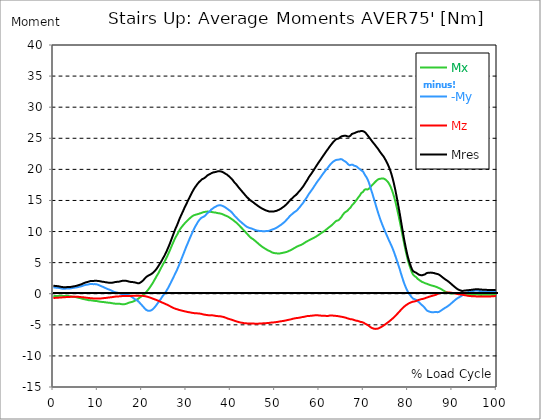
| Category |  Mx |  -My |  Mz |  Mres |
|---|---|---|---|---|
| 0.0 | -0.363 | 1.043 | -0.68 | 1.304 |
| 0.16678370786516855 | -0.363 | 1.006 | -0.68 | 1.276 |
| 0.3335674157303371 | -0.373 | 0.988 | -0.671 | 1.258 |
| 0.5003511235955057 | -0.373 | 0.978 | -0.661 | 1.248 |
| 0.6671348314606742 | -0.363 | 0.978 | -0.652 | 1.239 |
| 0.8339185393258427 | -0.373 | 0.96 | -0.643 | 1.22 |
| 1.0007022471910114 | -0.363 | 0.95 | -0.634 | 1.211 |
| 1.1674859550561796 | -0.345 | 0.941 | -0.624 | 1.192 |
| 1.3342696629213484 | -0.335 | 0.932 | -0.624 | 1.174 |
| 1.5010533707865168 | -0.326 | 0.904 | -0.615 | 1.155 |
| 1.6678370786516854 | -0.326 | 0.866 | -0.615 | 1.118 |
| 1.8346207865168538 | -0.335 | 0.829 | -0.606 | 1.09 |
| 2.001404494382023 | -0.345 | 0.811 | -0.587 | 1.071 |
| 2.1681882022471908 | -0.345 | 0.801 | -0.578 | 1.062 |
| 2.334971910112359 | -0.354 | 0.801 | -0.568 | 1.053 |
| 2.501755617977528 | -0.354 | 0.801 | -0.559 | 1.053 |
| 2.668539325842697 | -0.345 | 0.811 | -0.55 | 1.043 |
| 2.8353230337078656 | -0.326 | 0.82 | -0.54 | 1.043 |
| 3.0021067415730336 | -0.335 | 0.838 | -0.54 | 1.062 |
| 3.168890449438202 | -0.345 | 0.866 | -0.54 | 1.081 |
| 3.335674157303371 | -0.354 | 0.857 | -0.531 | 1.071 |
| 3.502457865168539 | -0.382 | 0.848 | -0.522 | 1.071 |
| 3.6692415730337076 | -0.401 | 0.838 | -0.512 | 1.071 |
| 3.8360252808988764 | -0.419 | 0.857 | -0.503 | 1.09 |
| 4.002808988764046 | -0.447 | 0.876 | -0.494 | 1.109 |
| 4.169592696629214 | -0.466 | 0.904 | -0.494 | 1.127 |
| 4.3363764044943816 | -0.475 | 0.922 | -0.484 | 1.146 |
| 4.50316011235955 | -0.484 | 0.941 | -0.484 | 1.174 |
| 4.669943820224718 | -0.494 | 0.969 | -0.494 | 1.192 |
| 4.836727528089888 | -0.512 | 0.978 | -0.503 | 1.22 |
| 5.003511235955056 | -0.531 | 0.997 | -0.503 | 1.239 |
| 5.170294943820225 | -0.559 | 1.015 | -0.503 | 1.267 |
| 5.337078651685394 | -0.596 | 1.034 | -0.503 | 1.295 |
| 5.5038623595505625 | -0.643 | 1.053 | -0.503 | 1.332 |
| 5.670646067415731 | -0.652 | 1.09 | -0.503 | 1.379 |
| 5.837429775280899 | -0.671 | 1.127 | -0.512 | 1.407 |
| 6.004213483146067 | -0.699 | 1.155 | -0.531 | 1.444 |
| 6.170997191011236 | -0.727 | 1.174 | -0.54 | 1.481 |
| 6.329002808988764 | -0.764 | 1.202 | -0.55 | 1.528 |
| 6.495786516853932 | -0.811 | 1.239 | -0.559 | 1.584 |
| 6.662570224719101 | -0.838 | 1.286 | -0.568 | 1.64 |
| 6.82935393258427 | -0.866 | 1.332 | -0.578 | 1.696 |
| 6.9961376404494375 | -0.885 | 1.379 | -0.596 | 1.742 |
| 7.162921348314607 | -0.913 | 1.416 | -0.615 | 1.798 |
| 7.329705056179775 | -0.932 | 1.435 | -0.634 | 1.826 |
| 7.496488764044945 | -0.96 | 1.453 | -0.652 | 1.854 |
| 7.663272471910113 | -0.988 | 1.463 | -0.661 | 1.882 |
| 7.830056179775281 | -1.015 | 1.481 | -0.671 | 1.919 |
| 7.996839887640449 | -1.043 | 1.509 | -0.68 | 1.956 |
| 8.16362359550562 | -1.053 | 1.537 | -0.699 | 1.994 |
| 8.330407303370787 | -1.053 | 1.584 | -0.717 | 2.031 |
| 8.497191011235955 | -1.062 | 1.593 | -0.727 | 2.05 |
| 8.663974719101123 | -1.081 | 1.574 | -0.736 | 2.05 |
| 8.830758426966291 | -1.09 | 1.556 | -0.745 | 2.04 |
| 8.99754213483146 | -1.118 | 1.537 | -0.755 | 2.05 |
| 9.16432584269663 | -1.146 | 1.547 | -0.764 | 2.068 |
| 9.331109550561798 | -1.155 | 1.547 | -0.773 | 2.078 |
| 9.497893258426966 | -1.165 | 1.547 | -0.773 | 2.087 |
| 9.664676966292134 | -1.174 | 1.537 | -0.773 | 2.087 |
| 9.831460674157304 | -1.183 | 1.5 | -0.783 | 2.068 |
| 9.998244382022472 | -1.202 | 1.463 | -0.783 | 2.059 |
| 10.16502808988764 | -1.22 | 1.416 | -0.783 | 2.04 |
| 10.331811797752808 | -1.258 | 1.36 | -0.773 | 2.031 |
| 10.498595505617978 | -1.286 | 1.314 | -0.773 | 2.012 |
| 10.665379213483147 | -1.295 | 1.258 | -0.764 | 1.984 |
| 10.832162921348315 | -1.314 | 1.202 | -0.745 | 1.956 |
| 10.998946629213483 | -1.323 | 1.155 | -0.736 | 1.938 |
| 11.165730337078653 | -1.332 | 1.109 | -0.717 | 1.919 |
| 11.33251404494382 | -1.342 | 1.062 | -0.708 | 1.91 |
| 11.49929775280899 | -1.351 | 1.006 | -0.699 | 1.891 |
| 11.666081460674157 | -1.369 | 0.941 | -0.689 | 1.863 |
| 11.832865168539326 | -1.388 | 0.885 | -0.68 | 1.845 |
| 11.999648876404493 | -1.407 | 0.829 | -0.661 | 1.826 |
| 12.166432584269662 | -1.425 | 0.783 | -0.643 | 1.807 |
| 12.333216292134832 | -1.435 | 0.727 | -0.624 | 1.789 |
| 12.5 | -1.435 | 0.68 | -0.606 | 1.77 |
| 12.66678370786517 | -1.444 | 0.643 | -0.596 | 1.761 |
| 12.833567415730336 | -1.463 | 0.596 | -0.578 | 1.761 |
| 13.000351123595506 | -1.491 | 0.54 | -0.568 | 1.77 |
| 13.167134831460674 | -1.519 | 0.475 | -0.559 | 1.77 |
| 13.333918539325843 | -1.537 | 0.419 | -0.54 | 1.779 |
| 13.500702247191011 | -1.556 | 0.363 | -0.522 | 1.789 |
| 13.667485955056181 | -1.574 | 0.307 | -0.494 | 1.826 |
| 13.834269662921349 | -1.593 | 0.27 | -0.484 | 1.863 |
| 14.001053370786519 | -1.602 | 0.233 | -0.466 | 1.882 |
| 14.167837078651687 | -1.602 | 0.196 | -0.456 | 1.891 |
| 14.334620786516853 | -1.612 | 0.186 | -0.447 | 1.91 |
| 14.501404494382026 | -1.612 | 0.168 | -0.447 | 1.919 |
| 14.668188202247192 | -1.612 | 0.13 | -0.438 | 1.919 |
| 14.834971910112362 | -1.612 | 0.075 | -0.419 | 1.947 |
| 15.001755617977528 | -1.621 | 0.028 | -0.41 | 1.975 |
| 15.168539325842698 | -1.64 | -0.019 | -0.401 | 2.003 |
| 15.335323033707864 | -1.668 | -0.056 | -0.391 | 2.04 |
| 15.502106741573034 | -1.686 | -0.093 | -0.373 | 2.068 |
| 15.6688904494382 | -1.705 | -0.13 | -0.363 | 2.087 |
| 15.83567415730337 | -1.696 | -0.14 | -0.363 | 2.087 |
| 16.00245786516854 | -1.686 | -0.14 | -0.354 | 2.096 |
| 16.16924157303371 | -1.677 | -0.14 | -0.354 | 2.105 |
| 16.336025280898877 | -1.64 | -0.149 | -0.363 | 2.087 |
| 16.502808988764045 | -1.602 | -0.158 | -0.363 | 2.059 |
| 16.669592696629216 | -1.556 | -0.177 | -0.363 | 2.031 |
| 16.83637640449438 | -1.5 | -0.196 | -0.373 | 1.994 |
| 17.003160112359552 | -1.453 | -0.224 | -0.373 | 1.966 |
| 17.169943820224717 | -1.416 | -0.279 | -0.373 | 1.938 |
| 17.336727528089888 | -1.388 | -0.354 | -0.363 | 1.91 |
| 17.503511235955056 | -1.369 | -0.438 | -0.354 | 1.901 |
| 17.670294943820224 | -1.332 | -0.512 | -0.354 | 1.882 |
| 17.837078651685395 | -1.295 | -0.587 | -0.345 | 1.873 |
| 18.003862359550563 | -1.258 | -0.671 | -0.335 | 1.863 |
| 18.17064606741573 | -1.202 | -0.773 | -0.326 | 1.845 |
| 18.3374297752809 | -1.137 | -0.866 | -0.317 | 1.826 |
| 18.504213483146067 | -1.071 | -0.941 | -0.317 | 1.826 |
| 18.662219101123597 | -1.015 | -0.978 | -0.317 | 1.77 |
| 18.829002808988765 | -0.95 | -1.043 | -0.317 | 1.714 |
| 18.995786516853933 | -0.876 | -1.127 | -0.317 | 1.696 |
| 19.1625702247191 | -0.783 | -1.23 | -0.307 | 1.677 |
| 19.32935393258427 | -0.699 | -1.351 | -0.307 | 1.696 |
| 19.49613764044944 | -0.624 | -1.5 | -0.307 | 1.751 |
| 19.662921348314608 | -0.531 | -1.612 | -0.307 | 1.807 |
| 19.829705056179776 | -0.438 | -1.751 | -0.317 | 1.901 |
| 19.996488764044944 | -0.345 | -1.873 | -0.326 | 1.984 |
| 20.163272471910112 | -0.252 | -1.994 | -0.335 | 2.078 |
| 20.33005617977528 | -0.149 | -2.143 | -0.354 | 2.208 |
| 20.49683988764045 | -0.037 | -2.273 | -0.373 | 2.338 |
| 20.663623595505616 | 0.084 | -2.404 | -0.401 | 2.478 |
| 20.830407303370787 | 0.196 | -2.525 | -0.419 | 2.599 |
| 20.997191011235955 | 0.317 | -2.627 | -0.447 | 2.72 |
| 21.163974719101123 | 0.456 | -2.683 | -0.484 | 2.795 |
| 21.330758426966295 | 0.596 | -2.73 | -0.512 | 2.879 |
| 21.497542134831463 | 0.745 | -2.758 | -0.55 | 2.944 |
| 21.66432584269663 | 0.913 | -2.758 | -0.587 | 3.009 |
| 21.8311095505618 | 1.09 | -2.73 | -0.624 | 3.074 |
| 21.997893258426966 | 1.258 | -2.692 | -0.671 | 3.13 |
| 22.164676966292134 | 1.435 | -2.646 | -0.717 | 3.195 |
| 22.331460674157306 | 1.621 | -2.553 | -0.764 | 3.289 |
| 22.498244382022467 | 1.826 | -2.432 | -0.811 | 3.391 |
| 22.66502808988764 | 2.031 | -2.32 | -0.848 | 3.503 |
| 22.831811797752806 | 2.245 | -2.189 | -0.894 | 3.624 |
| 22.99859550561798 | 2.45 | -2.05 | -0.941 | 3.754 |
| 23.165379213483146 | 2.664 | -1.901 | -0.988 | 3.894 |
| 23.332162921348313 | 2.879 | -1.733 | -1.034 | 4.053 |
| 23.49894662921348 | 3.074 | -1.574 | -1.081 | 4.23 |
| 23.665730337078653 | 3.261 | -1.397 | -1.127 | 4.416 |
| 23.83251404494382 | 3.484 | -1.22 | -1.183 | 4.612 |
| 23.999297752808985 | 3.717 | -1.071 | -1.239 | 4.779 |
| 24.166081460674157 | 3.959 | -0.913 | -1.295 | 4.966 |
| 24.332865168539325 | 4.192 | -0.736 | -1.351 | 5.18 |
| 24.499648876404496 | 4.425 | -0.55 | -1.397 | 5.394 |
| 24.666432584269664 | 4.658 | -0.363 | -1.453 | 5.627 |
| 24.833216292134832 | 4.863 | -0.214 | -1.5 | 5.832 |
| 25.0 | 5.049 | -0.084 | -1.556 | 6.028 |
| 25.16678370786517 | 5.273 | 0.084 | -1.602 | 6.261 |
| 25.33356741573034 | 5.506 | 0.27 | -1.658 | 6.512 |
| 25.500351123595504 | 5.748 | 0.456 | -1.714 | 6.764 |
| 25.66713483146067 | 6 | 0.661 | -1.77 | 7.024 |
| 25.833918539325843 | 6.251 | 0.866 | -1.826 | 7.304 |
| 26.00070224719101 | 6.521 | 1.081 | -1.891 | 7.583 |
| 26.16748595505618 | 6.792 | 1.304 | -1.947 | 7.872 |
| 26.334269662921347 | 7.062 | 1.537 | -2.012 | 8.17 |
| 26.50105337078652 | 7.351 | 1.77 | -2.078 | 8.487 |
| 26.667837078651687 | 7.639 | 2.022 | -2.143 | 8.804 |
| 26.834620786516858 | 7.928 | 2.255 | -2.208 | 9.121 |
| 27.001404494382022 | 8.189 | 2.506 | -2.255 | 9.437 |
| 27.16818820224719 | 8.459 | 2.758 | -2.31 | 9.754 |
| 27.334971910112362 | 8.72 | 3 | -2.366 | 10.071 |
| 27.50175561797753 | 8.981 | 3.242 | -2.413 | 10.378 |
| 27.668539325842698 | 9.195 | 3.494 | -2.45 | 10.649 |
| 27.835323033707866 | 9.391 | 3.736 | -2.478 | 10.909 |
| 28.002106741573037 | 9.605 | 4.015 | -2.515 | 11.198 |
| 28.168890449438205 | 9.829 | 4.285 | -2.553 | 11.496 |
| 28.335674157303373 | 10.052 | 4.565 | -2.599 | 11.804 |
| 28.502457865168537 | 10.267 | 4.882 | -2.627 | 12.102 |
| 28.669241573033705 | 10.462 | 5.189 | -2.664 | 12.372 |
| 28.836025280898877 | 10.621 | 5.487 | -2.692 | 12.624 |
| 29.002808988764052 | 10.779 | 5.776 | -2.72 | 12.894 |
| 29.169592696629213 | 10.928 | 6.074 | -2.748 | 13.145 |
| 29.336376404494384 | 11.068 | 6.382 | -2.776 | 13.406 |
| 29.50316011235955 | 11.217 | 6.68 | -2.804 | 13.695 |
| 29.669943820224724 | 11.347 | 6.987 | -2.841 | 13.956 |
| 29.836727528089884 | 11.468 | 7.295 | -2.869 | 14.189 |
| 30.003511235955056 | 11.589 | 7.593 | -2.888 | 14.431 |
| 30.170294943820224 | 11.711 | 7.872 | -2.916 | 14.673 |
| 30.337078651685395 | 11.822 | 8.142 | -2.944 | 14.925 |
| 30.503862359550563 | 11.943 | 8.431 | -2.963 | 15.158 |
| 30.670646067415728 | 12.055 | 8.711 | -2.981 | 15.391 |
| 30.837429775280903 | 12.167 | 9 | -3.009 | 15.642 |
| 30.99543539325843 | 12.27 | 9.27 | -3.028 | 15.884 |
| 31.162219101123597 | 12.372 | 9.549 | -3.056 | 16.136 |
| 31.32900280898876 | 12.465 | 9.81 | -3.074 | 16.359 |
| 31.495786516853936 | 12.54 | 10.052 | -3.093 | 16.564 |
| 31.6625702247191 | 12.605 | 10.313 | -3.112 | 16.779 |
| 31.82935393258427 | 12.652 | 10.574 | -3.13 | 16.974 |
| 31.996137640449433 | 12.689 | 10.807 | -3.14 | 17.161 |
| 32.162921348314605 | 12.726 | 10.993 | -3.14 | 17.319 |
| 32.329705056179776 | 12.754 | 11.198 | -3.149 | 17.477 |
| 32.49648876404494 | 12.782 | 11.412 | -3.158 | 17.645 |
| 32.66327247191011 | 12.819 | 11.608 | -3.168 | 17.794 |
| 32.83005617977528 | 12.866 | 11.757 | -3.186 | 17.934 |
| 32.996839887640455 | 12.903 | 11.925 | -3.195 | 18.055 |
| 33.16362359550562 | 12.931 | 12.046 | -3.214 | 18.157 |
| 33.330407303370784 | 12.978 | 12.176 | -3.233 | 18.279 |
| 33.497191011235955 | 13.033 | 12.288 | -3.261 | 18.4 |
| 33.66397471910113 | 13.071 | 12.307 | -3.298 | 18.446 |
| 33.83075842696629 | 13.117 | 12.335 | -3.335 | 18.502 |
| 33.997542134831455 | 13.145 | 12.419 | -3.354 | 18.595 |
| 34.164325842696634 | 13.145 | 12.502 | -3.372 | 18.651 |
| 34.3311095505618 | 13.173 | 12.624 | -3.391 | 18.744 |
| 34.49789325842697 | 13.201 | 12.754 | -3.41 | 18.856 |
| 34.66467696629213 | 13.21 | 12.903 | -3.428 | 18.968 |
| 34.831460674157306 | 13.201 | 13.061 | -3.438 | 19.07 |
| 34.99824438202247 | 13.201 | 13.108 | -3.466 | 19.108 |
| 35.16502808988764 | 13.201 | 13.229 | -3.475 | 19.192 |
| 35.331811797752806 | 13.192 | 13.304 | -3.484 | 19.238 |
| 35.49859550561798 | 13.164 | 13.453 | -3.466 | 19.322 |
| 35.66537921348315 | 13.145 | 13.565 | -3.466 | 19.387 |
| 35.83216292134831 | 13.117 | 13.667 | -3.475 | 19.443 |
| 35.998946629213485 | 13.108 | 13.723 | -3.484 | 19.471 |
| 36.16573033707865 | 13.08 | 13.863 | -3.494 | 19.527 |
| 36.33251404494382 | 13.061 | 13.909 | -3.522 | 19.546 |
| 36.499297752808985 | 13.052 | 13.956 | -3.55 | 19.564 |
| 36.666081460674164 | 13.043 | 14.012 | -3.568 | 19.592 |
| 36.83286516853932 | 13.015 | 14.077 | -3.577 | 19.629 |
| 36.99964887640449 | 12.968 | 14.161 | -3.596 | 19.667 |
| 37.166432584269664 | 12.968 | 14.198 | -3.605 | 19.695 |
| 37.333216292134836 | 12.95 | 14.217 | -3.624 | 19.704 |
| 37.5 | 12.922 | 14.217 | -3.624 | 19.695 |
| 37.666783707865164 | 12.894 | 14.226 | -3.633 | 19.695 |
| 37.833567415730336 | 12.866 | 14.198 | -3.652 | 19.667 |
| 38.00035112359551 | 12.829 | 14.17 | -3.68 | 19.629 |
| 38.16713483146068 | 12.791 | 14.114 | -3.699 | 19.574 |
| 38.333918539325836 | 12.735 | 14.068 | -3.727 | 19.518 |
| 38.50070224719101 | 12.67 | 14.021 | -3.764 | 19.452 |
| 38.66748595505618 | 12.614 | 13.937 | -3.801 | 19.369 |
| 38.83426966292135 | 12.558 | 13.863 | -3.848 | 19.285 |
| 39.001053370786515 | 12.521 | 13.779 | -3.894 | 19.219 |
| 39.16783707865169 | 12.484 | 13.704 | -3.941 | 19.164 |
| 39.33462078651686 | 12.419 | 13.611 | -3.997 | 19.061 |
| 39.50140449438202 | 12.353 | 13.518 | -4.034 | 18.959 |
| 39.668188202247194 | 12.279 | 13.425 | -4.062 | 18.856 |
| 39.83497191011236 | 12.195 | 13.341 | -4.099 | 18.744 |
| 40.00175561797753 | 12.111 | 13.257 | -4.136 | 18.642 |
| 40.168539325842694 | 12.027 | 13.155 | -4.164 | 18.521 |
| 40.335323033707866 | 11.962 | 13.015 | -4.211 | 18.39 |
| 40.50210674157304 | 11.878 | 12.866 | -4.258 | 18.241 |
| 40.6688904494382 | 11.776 | 12.717 | -4.295 | 18.083 |
| 40.83567415730337 | 11.673 | 12.568 | -4.332 | 17.915 |
| 41.00245786516854 | 11.58 | 12.447 | -4.379 | 17.785 |
| 41.16924157303371 | 11.506 | 12.344 | -4.416 | 17.673 |
| 41.33602528089887 | 11.412 | 12.223 | -4.463 | 17.533 |
| 41.502808988764045 | 11.291 | 12.102 | -4.5 | 17.384 |
| 41.669592696629216 | 11.17 | 11.953 | -4.528 | 17.216 |
| 41.83637640449439 | 11.049 | 11.832 | -4.565 | 17.067 |
| 42.00316011235955 | 10.919 | 11.729 | -4.593 | 16.928 |
| 42.16994382022472 | 10.798 | 11.636 | -4.612 | 16.788 |
| 42.33672752808989 | 10.667 | 11.543 | -4.64 | 16.648 |
| 42.50351123595506 | 10.546 | 11.431 | -4.667 | 16.508 |
| 42.670294943820224 | 10.425 | 11.319 | -4.686 | 16.369 |
| 42.83707865168539 | 10.313 | 11.189 | -4.714 | 16.22 |
| 43.00386235955057 | 10.173 | 11.124 | -4.733 | 16.089 |
| 43.17064606741573 | 10.043 | 11.021 | -4.742 | 15.949 |
| 43.32865168539326 | 9.922 | 10.928 | -4.751 | 15.81 |
| 43.495435393258425 | 9.791 | 10.853 | -4.761 | 15.679 |
| 43.6622191011236 | 9.661 | 10.76 | -4.77 | 15.54 |
| 43.82900280898876 | 9.531 | 10.704 | -4.77 | 15.418 |
| 43.99578651685393 | 9.4 | 10.649 | -4.779 | 15.307 |
| 44.162570224719104 | 9.279 | 10.602 | -4.779 | 15.186 |
| 44.32935393258427 | 9.149 | 10.555 | -4.779 | 15.083 |
| 44.49613764044944 | 9.037 | 10.518 | -4.789 | 14.981 |
| 44.66292134831461 | 8.934 | 10.499 | -4.789 | 14.906 |
| 44.82970505617978 | 8.878 | 10.444 | -4.798 | 14.832 |
| 44.99648876404493 | 8.804 | 10.406 | -4.798 | 14.757 |
| 45.16327247191011 | 8.711 | 10.35 | -4.798 | 14.664 |
| 45.33005617977528 | 8.608 | 10.304 | -4.807 | 14.561 |
| 45.49683988764045 | 8.515 | 10.248 | -4.807 | 14.468 |
| 45.66362359550561 | 8.413 | 10.211 | -4.817 | 14.375 |
| 45.83040730337079 | 8.31 | 10.173 | -4.817 | 14.291 |
| 45.99719101123596 | 8.208 | 10.155 | -4.817 | 14.207 |
| 46.16397471910113 | 8.096 | 10.127 | -4.817 | 14.114 |
| 46.33075842696629 | 7.993 | 10.117 | -4.807 | 14.03 |
| 46.497542134831455 | 7.9 | 10.09 | -4.807 | 13.946 |
| 46.66432584269663 | 7.798 | 10.071 | -4.798 | 13.872 |
| 46.83110955056179 | 7.705 | 10.062 | -4.789 | 13.807 |
| 46.99789325842696 | 7.611 | 10.071 | -4.779 | 13.732 |
| 47.164676966292134 | 7.528 | 10.062 | -4.77 | 13.667 |
| 47.331460674157306 | 7.444 | 10.062 | -4.761 | 13.602 |
| 47.49824438202247 | 7.369 | 10.062 | -4.761 | 13.546 |
| 47.66502808988764 | 7.295 | 10.062 | -4.751 | 13.49 |
| 47.83181179775281 | 7.229 | 10.062 | -4.742 | 13.434 |
| 47.99859550561797 | 7.146 | 10.071 | -4.733 | 13.388 |
| 48.16537921348314 | 7.071 | 10.09 | -4.723 | 13.341 |
| 48.33216292134831 | 7.006 | 10.09 | -4.714 | 13.304 |
| 48.498946629213485 | 6.95 | 10.09 | -4.705 | 13.257 |
| 48.66573033707865 | 6.894 | 10.117 | -4.695 | 13.238 |
| 48.83251404494382 | 6.847 | 10.155 | -4.677 | 13.238 |
| 48.99929775280899 | 6.782 | 10.22 | -4.649 | 13.238 |
| 49.166081460674164 | 6.726 | 10.257 | -4.64 | 13.22 |
| 49.33286516853933 | 6.643 | 10.313 | -4.63 | 13.21 |
| 49.499648876404486 | 6.587 | 10.341 | -4.621 | 13.201 |
| 49.666432584269664 | 6.568 | 10.388 | -4.612 | 13.22 |
| 49.83321629213483 | 6.54 | 10.444 | -4.602 | 13.248 |
| 50.0 | 6.521 | 10.49 | -4.584 | 13.276 |
| 50.166783707865164 | 6.512 | 10.546 | -4.574 | 13.304 |
| 50.33356741573034 | 6.503 | 10.602 | -4.556 | 13.332 |
| 50.50035112359551 | 6.484 | 10.676 | -4.546 | 13.378 |
| 50.66713483146068 | 6.466 | 10.76 | -4.518 | 13.434 |
| 50.83391853932584 | 6.466 | 10.835 | -4.5 | 13.481 |
| 51.00070224719101 | 6.466 | 10.919 | -4.472 | 13.546 |
| 51.16748595505618 | 6.484 | 10.993 | -4.453 | 13.611 |
| 51.33426966292134 | 6.512 | 11.068 | -4.435 | 13.676 |
| 51.50105337078652 | 6.54 | 11.17 | -4.416 | 13.769 |
| 51.66783707865169 | 6.559 | 11.263 | -4.397 | 13.853 |
| 51.83462078651686 | 6.577 | 11.366 | -4.379 | 13.937 |
| 52.00140449438202 | 6.615 | 11.45 | -4.36 | 14.012 |
| 52.168188202247194 | 6.643 | 11.534 | -4.332 | 14.096 |
| 52.33497191011236 | 6.67 | 11.673 | -4.313 | 14.217 |
| 52.50175561797752 | 6.689 | 11.822 | -4.285 | 14.338 |
| 52.668539325842694 | 6.726 | 11.934 | -4.258 | 14.45 |
| 52.835323033707866 | 6.782 | 12.037 | -4.239 | 14.561 |
| 53.00210674157304 | 6.838 | 12.186 | -4.211 | 14.701 |
| 53.1688904494382 | 6.885 | 12.344 | -4.183 | 14.85 |
| 53.33567415730337 | 6.941 | 12.484 | -4.155 | 14.981 |
| 53.502457865168545 | 6.987 | 12.596 | -4.136 | 15.102 |
| 53.669241573033716 | 7.043 | 12.698 | -4.108 | 15.213 |
| 53.83602528089887 | 7.118 | 12.782 | -4.081 | 15.316 |
| 54.002808988764045 | 7.192 | 12.884 | -4.034 | 15.428 |
| 54.169592696629216 | 7.267 | 12.996 | -3.987 | 15.549 |
| 54.33637640449438 | 7.332 | 13.108 | -3.978 | 15.67 |
| 54.50316011235955 | 7.388 | 13.183 | -3.95 | 15.763 |
| 54.669943820224724 | 7.462 | 13.248 | -3.931 | 15.847 |
| 54.836727528089895 | 7.528 | 13.341 | -3.913 | 15.959 |
| 55.00351123595506 | 7.602 | 13.443 | -3.904 | 16.08 |
| 55.17029494382022 | 7.658 | 13.592 | -3.894 | 16.238 |
| 55.337078651685395 | 7.705 | 13.723 | -3.876 | 16.369 |
| 55.50386235955056 | 7.751 | 13.853 | -3.857 | 16.49 |
| 55.66186797752809 | 7.788 | 13.993 | -3.829 | 16.63 |
| 55.82865168539326 | 7.835 | 14.151 | -3.801 | 16.779 |
| 55.995435393258425 | 7.891 | 14.31 | -3.773 | 16.928 |
| 56.1622191011236 | 7.956 | 14.459 | -3.754 | 17.086 |
| 56.32900280898877 | 8.021 | 14.599 | -3.736 | 17.235 |
| 56.49578651685393 | 8.105 | 14.776 | -3.717 | 17.412 |
| 56.6625702247191 | 8.18 | 14.953 | -3.699 | 17.608 |
| 56.82935393258427 | 8.254 | 15.13 | -3.671 | 17.794 |
| 56.99613764044943 | 8.338 | 15.307 | -3.633 | 17.98 |
| 57.16292134831461 | 8.413 | 15.484 | -3.615 | 18.167 |
| 57.329705056179776 | 8.469 | 15.67 | -3.587 | 18.353 |
| 57.49648876404495 | 8.534 | 15.884 | -3.577 | 18.567 |
| 57.66327247191011 | 8.59 | 16.08 | -3.568 | 18.772 |
| 57.83005617977529 | 8.646 | 16.238 | -3.568 | 18.931 |
| 57.99683988764044 | 8.72 | 16.397 | -3.559 | 19.108 |
| 58.16362359550561 | 8.776 | 16.564 | -3.55 | 19.275 |
| 58.33040730337079 | 8.841 | 16.723 | -3.531 | 19.443 |
| 58.497191011235955 | 8.897 | 16.89 | -3.522 | 19.62 |
| 58.66397471910112 | 8.953 | 17.067 | -3.503 | 19.797 |
| 58.83075842696629 | 9.018 | 17.263 | -3.484 | 19.993 |
| 58.99754213483147 | 9.083 | 17.44 | -3.475 | 20.179 |
| 59.164325842696634 | 9.149 | 17.617 | -3.466 | 20.365 |
| 59.33110955056179 | 9.223 | 17.803 | -3.466 | 20.561 |
| 59.49789325842697 | 9.307 | 17.962 | -3.475 | 20.729 |
| 59.664676966292134 | 9.381 | 18.148 | -3.475 | 20.934 |
| 59.8314606741573 | 9.465 | 18.307 | -3.484 | 21.101 |
| 59.99824438202247 | 9.54 | 18.456 | -3.494 | 21.269 |
| 60.16502808988765 | 9.624 | 18.614 | -3.512 | 21.437 |
| 60.33181179775281 | 9.708 | 18.782 | -3.522 | 21.614 |
| 60.49859550561798 | 9.791 | 18.949 | -3.531 | 21.791 |
| 60.66537921348315 | 9.866 | 19.108 | -3.54 | 21.968 |
| 60.83216292134831 | 9.931 | 19.294 | -3.54 | 22.145 |
| 60.99894662921348 | 10.006 | 19.452 | -3.54 | 22.313 |
| 61.16573033707864 | 10.09 | 19.601 | -3.55 | 22.48 |
| 61.33251404494383 | 10.183 | 19.76 | -3.559 | 22.657 |
| 61.49929775280899 | 10.285 | 19.909 | -3.559 | 22.834 |
| 61.66608146067416 | 10.378 | 20.049 | -3.568 | 23.002 |
| 61.83286516853932 | 10.481 | 20.179 | -3.577 | 23.16 |
| 61.99964887640451 | 10.574 | 20.337 | -3.568 | 23.319 |
| 62.16643258426967 | 10.658 | 20.505 | -3.54 | 23.496 |
| 62.33321629213482 | 10.76 | 20.664 | -3.512 | 23.663 |
| 62.5 | 10.853 | 20.803 | -3.503 | 23.822 |
| 62.66678370786517 | 10.937 | 20.934 | -3.494 | 23.971 |
| 62.833567415730336 | 11.04 | 21.055 | -3.503 | 24.12 |
| 63.0003511235955 | 11.161 | 21.167 | -3.512 | 24.278 |
| 63.16713483146068 | 11.291 | 21.26 | -3.54 | 24.427 |
| 63.33391853932585 | 11.385 | 21.334 | -3.54 | 24.539 |
| 63.500702247191015 | 11.515 | 21.418 | -3.55 | 24.679 |
| 63.66748595505618 | 11.636 | 21.483 | -3.559 | 24.781 |
| 63.83426966292135 | 11.739 | 21.521 | -3.568 | 24.874 |
| 64.00105337078651 | 11.766 | 21.539 | -3.587 | 24.912 |
| 64.16783707865169 | 11.776 | 21.549 | -3.596 | 24.921 |
| 64.33462078651687 | 11.813 | 21.567 | -3.615 | 24.958 |
| 64.50140449438203 | 11.916 | 21.586 | -3.643 | 25.033 |
| 64.6681882022472 | 12.065 | 21.623 | -3.661 | 25.145 |
| 64.83497191011236 | 12.204 | 21.651 | -3.68 | 25.238 |
| 65.00175561797754 | 12.344 | 21.66 | -3.708 | 25.312 |
| 65.16853932584269 | 12.549 | 21.586 | -3.717 | 25.35 |
| 65.33532303370787 | 12.726 | 21.493 | -3.745 | 25.368 |
| 65.50210674157304 | 12.866 | 21.4 | -3.773 | 25.368 |
| 65.66889044943821 | 13.015 | 21.334 | -3.801 | 25.406 |
| 65.83567415730337 | 13.127 | 21.278 | -3.829 | 25.433 |
| 66.00245786516854 | 13.183 | 21.185 | -3.866 | 25.396 |
| 66.1692415730337 | 13.248 | 21.083 | -3.904 | 25.359 |
| 66.33602528089888 | 13.341 | 20.943 | -3.95 | 25.312 |
| 66.50280898876404 | 13.481 | 20.813 | -3.987 | 25.294 |
| 66.66959269662921 | 13.602 | 20.673 | -4.025 | 25.266 |
| 66.83637640449439 | 13.723 | 20.654 | -4.062 | 25.331 |
| 67.00316011235955 | 13.825 | 20.682 | -4.09 | 25.406 |
| 67.16994382022472 | 14.002 | 20.729 | -4.108 | 25.545 |
| 67.33672752808988 | 14.189 | 20.766 | -4.118 | 25.685 |
| 67.50351123595506 | 14.319 | 20.757 | -4.146 | 25.75 |
| 67.67029494382022 | 14.44 | 20.673 | -4.174 | 25.769 |
| 67.83707865168539 | 14.561 | 20.598 | -4.22 | 25.787 |
| 67.99508426966291 | 14.71 | 20.57 | -4.267 | 25.853 |
| 68.16186797752809 | 14.878 | 20.533 | -4.304 | 25.918 |
| 68.32865168539327 | 15.027 | 20.468 | -4.332 | 25.964 |
| 68.49543539325843 | 15.186 | 20.421 | -4.351 | 26.011 |
| 68.6622191011236 | 15.363 | 20.347 | -4.369 | 26.067 |
| 68.82900280898876 | 15.53 | 20.188 | -4.416 | 26.058 |
| 68.99578651685394 | 15.679 | 20.086 | -4.453 | 26.076 |
| 69.1625702247191 | 15.819 | 20.03 | -4.481 | 26.114 |
| 69.32935393258425 | 16.033 | 19.928 | -4.537 | 26.151 |
| 69.49613764044945 | 16.21 | 19.825 | -4.565 | 26.179 |
| 69.66292134831461 | 16.285 | 19.751 | -4.574 | 26.169 |
| 69.82970505617978 | 16.359 | 19.676 | -4.593 | 26.151 |
| 69.99648876404494 | 16.518 | 19.49 | -4.667 | 26.104 |
| 70.16327247191012 | 16.704 | 19.266 | -4.761 | 26.039 |
| 70.33005617977528 | 16.797 | 19.061 | -4.826 | 25.955 |
| 70.49683988764045 | 16.816 | 18.875 | -4.891 | 25.834 |
| 70.66362359550561 | 16.76 | 18.698 | -4.938 | 25.676 |
| 70.83040730337079 | 16.751 | 18.465 | -5.003 | 25.517 |
| 70.99719101123596 | 16.788 | 18.204 | -5.077 | 25.368 |
| 71.16397471910112 | 16.872 | 17.906 | -5.161 | 25.219 |
| 71.3307584269663 | 16.993 | 17.552 | -5.245 | 25.07 |
| 71.49754213483146 | 17.142 | 17.151 | -5.348 | 24.893 |
| 71.66432584269663 | 17.282 | 16.76 | -5.441 | 24.735 |
| 71.83110955056179 | 17.403 | 16.387 | -5.497 | 24.586 |
| 71.99789325842697 | 17.533 | 16.024 | -5.543 | 24.446 |
| 72.16467696629215 | 17.645 | 15.605 | -5.599 | 24.269 |
| 72.3314606741573 | 17.785 | 15.223 | -5.627 | 24.129 |
| 72.49824438202248 | 17.906 | 14.832 | -5.646 | 23.989 |
| 72.66502808988764 | 18.027 | 14.431 | -5.655 | 23.831 |
| 72.8318117977528 | 18.139 | 14.021 | -5.655 | 23.673 |
| 72.99859550561797 | 18.251 | 13.63 | -5.646 | 23.524 |
| 73.16537921348315 | 18.344 | 13.238 | -5.618 | 23.375 |
| 73.33216292134833 | 18.428 | 12.866 | -5.58 | 23.216 |
| 73.49894662921349 | 18.456 | 12.502 | -5.525 | 23.03 |
| 73.66573033707864 | 18.474 | 12.148 | -5.469 | 22.844 |
| 73.83251404494382 | 18.502 | 11.804 | -5.403 | 22.676 |
| 73.99929775280899 | 18.521 | 11.487 | -5.329 | 22.517 |
| 74.16608146067415 | 18.539 | 11.18 | -5.264 | 22.368 |
| 74.33286516853933 | 18.549 | 10.872 | -5.189 | 22.21 |
| 74.49964887640449 | 18.53 | 10.593 | -5.105 | 22.061 |
| 74.66643258426967 | 18.474 | 10.294 | -5.031 | 21.865 |
| 74.83321629213484 | 18.409 | 10.015 | -4.947 | 21.651 |
| 75.0 | 18.316 | 9.736 | -4.863 | 21.446 |
| 75.16678370786516 | 18.213 | 9.475 | -4.77 | 21.222 |
| 75.33356741573033 | 18.083 | 9.195 | -4.686 | 20.98 |
| 75.5003511235955 | 17.943 | 8.925 | -4.602 | 20.719 |
| 75.66713483146067 | 17.766 | 8.655 | -4.509 | 20.44 |
| 75.83391853932585 | 17.561 | 8.394 | -4.407 | 20.142 |
| 76.00070224719101 | 17.338 | 8.142 | -4.313 | 19.825 |
| 76.16748595505618 | 17.067 | 7.882 | -4.211 | 19.471 |
| 76.33426966292136 | 16.76 | 7.621 | -4.108 | 19.07 |
| 76.50105337078652 | 16.434 | 7.332 | -4.015 | 18.642 |
| 76.66783707865167 | 16.071 | 7.034 | -3.904 | 18.185 |
| 76.83462078651685 | 15.67 | 6.726 | -3.792 | 17.692 |
| 77.00140449438202 | 15.232 | 6.391 | -3.671 | 17.161 |
| 77.1681882022472 | 14.794 | 6.046 | -3.559 | 16.611 |
| 77.33497191011236 | 14.3 | 5.702 | -3.438 | 16.015 |
| 77.50175561797754 | 13.779 | 5.329 | -3.307 | 15.391 |
| 77.6685393258427 | 13.248 | 4.975 | -3.177 | 14.757 |
| 77.83532303370787 | 12.707 | 4.602 | -3.056 | 14.114 |
| 78.00210674157303 | 12.139 | 4.239 | -2.925 | 13.443 |
| 78.1688904494382 | 11.562 | 3.876 | -2.786 | 12.773 |
| 78.33567415730337 | 10.975 | 3.466 | -2.655 | 12.074 |
| 78.50245786516854 | 10.369 | 3.074 | -2.534 | 11.366 |
| 78.66924157303372 | 9.754 | 2.711 | -2.404 | 10.667 |
| 78.83602528089888 | 9.149 | 2.338 | -2.292 | 9.968 |
| 79.00280898876404 | 8.543 | 1.956 | -2.171 | 9.279 |
| 79.16959269662921 | 7.956 | 1.63 | -2.068 | 8.627 |
| 79.33637640449439 | 7.378 | 1.323 | -1.966 | 8.003 |
| 79.50316011235955 | 6.838 | 1.034 | -1.873 | 7.425 |
| 79.66994382022472 | 6.316 | 0.764 | -1.789 | 6.875 |
| 79.8367275280899 | 5.813 | 0.512 | -1.705 | 6.344 |
| 80.00351123595506 | 5.338 | 0.279 | -1.63 | 5.86 |
| 80.17029494382022 | 4.919 | 0.075 | -1.556 | 5.422 |
| 80.32830056179776 | 4.546 | -0.075 | -1.5 | 5.049 |
| 80.49508426966293 | 4.192 | -0.224 | -1.444 | 4.705 |
| 80.66186797752809 | 3.848 | -0.401 | -1.397 | 4.36 |
| 80.82865168539325 | 3.531 | -0.568 | -1.351 | 4.053 |
| 80.99543539325842 | 3.27 | -0.689 | -1.304 | 3.82 |
| 81.1622191011236 | 3.056 | -0.801 | -1.276 | 3.633 |
| 81.32900280898878 | 2.897 | -0.866 | -1.258 | 3.512 |
| 81.49578651685394 | 2.823 | -0.894 | -1.248 | 3.475 |
| 81.6625702247191 | 2.767 | -0.922 | -1.211 | 3.447 |
| 81.82935393258427 | 2.674 | -0.988 | -1.155 | 3.382 |
| 81.99613764044945 | 2.534 | -1.09 | -1.109 | 3.279 |
| 82.16292134831461 | 2.404 | -1.183 | -1.062 | 3.205 |
| 82.32970505617978 | 2.31 | -1.276 | -1.015 | 3.13 |
| 82.49648876404494 | 2.227 | -1.388 | -0.988 | 3.056 |
| 82.66327247191012 | 2.143 | -1.509 | -0.95 | 3.018 |
| 82.83005617977528 | 2.059 | -1.63 | -0.913 | 2.991 |
| 82.99683988764045 | 1.966 | -1.742 | -0.876 | 2.963 |
| 83.16362359550563 | 1.901 | -1.835 | -0.857 | 2.963 |
| 83.33040730337079 | 1.873 | -1.938 | -0.829 | 3.009 |
| 83.49719101123596 | 1.817 | -2.05 | -0.801 | 3.046 |
| 83.66397471910112 | 1.761 | -2.161 | -0.773 | 3.056 |
| 83.8307584269663 | 1.696 | -2.31 | -0.736 | 3.112 |
| 83.99754213483146 | 1.658 | -2.478 | -0.68 | 3.205 |
| 84.16432584269663 | 1.621 | -2.637 | -0.634 | 3.298 |
| 84.33110955056179 | 1.584 | -2.739 | -0.596 | 3.345 |
| 84.49789325842697 | 1.537 | -2.795 | -0.55 | 3.372 |
| 84.66467696629213 | 1.472 | -2.832 | -0.512 | 3.372 |
| 84.8314606741573 | 1.435 | -2.86 | -0.475 | 3.372 |
| 84.99824438202248 | 1.388 | -2.916 | -0.438 | 3.391 |
| 85.16502808988764 | 1.351 | -2.963 | -0.401 | 3.4 |
| 85.3318117977528 | 1.323 | -2.972 | -0.363 | 3.391 |
| 85.49859550561797 | 1.295 | -2.972 | -0.345 | 3.363 |
| 85.66537921348315 | 1.267 | -2.981 | -0.298 | 3.354 |
| 85.83216292134831 | 1.23 | -2.972 | -0.261 | 3.335 |
| 85.99894662921348 | 1.202 | -2.953 | -0.242 | 3.289 |
| 86.16573033707866 | 1.155 | -2.935 | -0.196 | 3.251 |
| 86.33251404494384 | 1.109 | -2.925 | -0.158 | 3.214 |
| 86.499297752809 | 1.071 | -2.935 | -0.102 | 3.195 |
| 86.66608146067415 | 1.015 | -2.972 | -0.037 | 3.195 |
| 86.83286516853933 | 0.96 | -2.953 | 0.019 | 3.14 |
| 86.99964887640449 | 0.904 | -2.916 | 0.056 | 3.084 |
| 87.16643258426966 | 0.857 | -2.841 | 0.065 | 2.991 |
| 87.33321629213482 | 0.801 | -2.767 | 0.084 | 2.907 |
| 87.5 | 0.736 | -2.692 | 0.102 | 2.814 |
| 87.66678370786518 | 0.661 | -2.609 | 0.121 | 2.711 |
| 87.83356741573033 | 0.587 | -2.534 | 0.13 | 2.618 |
| 88.00035112359551 | 0.522 | -2.441 | 0.13 | 2.525 |
| 88.16713483146067 | 0.438 | -2.376 | 0.14 | 2.441 |
| 88.33391853932584 | 0.382 | -2.282 | 0.149 | 2.338 |
| 88.500702247191 | 0.307 | -2.217 | 0.158 | 2.264 |
| 88.66748595505618 | 0.252 | -2.152 | 0.177 | 2.189 |
| 88.83426966292136 | 0.196 | -2.078 | 0.186 | 2.115 |
| 89.00105337078652 | 0.158 | -1.994 | 0.196 | 2.022 |
| 89.16783707865169 | 0.112 | -1.91 | 0.196 | 1.938 |
| 89.33462078651687 | 0.075 | -1.817 | 0.196 | 1.845 |
| 89.50140449438203 | 0.047 | -1.714 | 0.186 | 1.733 |
| 89.6681882022472 | 0.037 | -1.612 | 0.168 | 1.64 |
| 89.83497191011236 | 0.037 | -1.509 | 0.149 | 1.528 |
| 90.00175561797754 | 0.056 | -1.407 | 0.13 | 1.425 |
| 90.16853932584269 | 0.065 | -1.295 | 0.112 | 1.314 |
| 90.33532303370787 | 0.075 | -1.192 | 0.093 | 1.211 |
| 90.50210674157303 | 0.084 | -1.09 | 0.065 | 1.118 |
| 90.6688904494382 | 0.084 | -0.997 | 0.037 | 1.025 |
| 90.83567415730336 | 0.084 | -0.894 | 0.009 | 0.922 |
| 91.00245786516854 | 0.084 | -0.801 | -0.019 | 0.82 |
| 91.1692415730337 | 0.075 | -0.717 | -0.037 | 0.745 |
| 91.33602528089888 | 0.037 | -0.652 | -0.065 | 0.68 |
| 91.50280898876404 | 0.009 | -0.587 | -0.084 | 0.615 |
| 91.66959269662922 | -0.037 | -0.522 | -0.102 | 0.568 |
| 91.83637640449439 | -0.075 | -0.456 | -0.112 | 0.531 |
| 92.00316011235955 | -0.102 | -0.382 | -0.13 | 0.494 |
| 92.16994382022472 | -0.112 | -0.298 | -0.149 | 0.447 |
| 92.3367275280899 | -0.13 | -0.205 | -0.168 | 0.438 |
| 92.50351123595506 | -0.14 | -0.102 | -0.196 | 0.466 |
| 92.66151685393258 | -0.13 | -0.028 | -0.214 | 0.494 |
| 92.82830056179776 | -0.112 | 0.047 | -0.242 | 0.522 |
| 92.99508426966291 | -0.102 | 0.102 | -0.261 | 0.55 |
| 93.16186797752809 | -0.093 | 0.158 | -0.289 | 0.54 |
| 93.32865168539325 | -0.084 | 0.214 | -0.307 | 0.55 |
| 93.49543539325842 | -0.093 | 0.242 | -0.326 | 0.559 |
| 93.66221910112358 | -0.093 | 0.279 | -0.345 | 0.559 |
| 93.82900280898876 | -0.121 | 0.298 | -0.363 | 0.587 |
| 93.99578651685393 | -0.14 | 0.326 | -0.373 | 0.606 |
| 94.1625702247191 | -0.158 | 0.354 | -0.382 | 0.615 |
| 94.32935393258427 | -0.177 | 0.382 | -0.391 | 0.624 |
| 94.49613764044945 | -0.196 | 0.401 | -0.391 | 0.643 |
| 94.66292134831461 | -0.214 | 0.429 | -0.401 | 0.671 |
| 94.82970505617978 | -0.205 | 0.456 | -0.401 | 0.68 |
| 94.99648876404494 | -0.177 | 0.484 | -0.41 | 0.699 |
| 95.16327247191012 | -0.158 | 0.503 | -0.419 | 0.708 |
| 95.33005617977528 | -0.149 | 0.512 | -0.429 | 0.717 |
| 95.49683988764046 | -0.13 | 0.522 | -0.438 | 0.727 |
| 95.66362359550563 | -0.13 | 0.512 | -0.447 | 0.727 |
| 95.83040730337078 | -0.14 | 0.484 | -0.456 | 0.717 |
| 95.99719101123594 | -0.149 | 0.466 | -0.456 | 0.708 |
| 96.16397471910112 | -0.177 | 0.438 | -0.456 | 0.689 |
| 96.33075842696628 | -0.196 | 0.41 | -0.456 | 0.68 |
| 96.49754213483145 | -0.196 | 0.401 | -0.456 | 0.671 |
| 96.66432584269663 | -0.186 | 0.401 | -0.456 | 0.661 |
| 96.8311095505618 | -0.177 | 0.391 | -0.456 | 0.652 |
| 96.99789325842697 | -0.168 | 0.382 | -0.456 | 0.652 |
| 97.16467696629213 | -0.158 | 0.382 | -0.466 | 0.643 |
| 97.3314606741573 | -0.168 | 0.363 | -0.466 | 0.643 |
| 97.49824438202248 | -0.158 | 0.363 | -0.466 | 0.634 |
| 97.66502808988764 | -0.158 | 0.354 | -0.466 | 0.634 |
| 97.8318117977528 | -0.158 | 0.335 | -0.456 | 0.615 |
| 97.99859550561798 | -0.149 | 0.335 | -0.456 | 0.606 |
| 98.16537921348316 | -0.158 | 0.326 | -0.447 | 0.606 |
| 98.33216292134833 | -0.158 | 0.326 | -0.438 | 0.596 |
| 98.49894662921349 | -0.149 | 0.326 | -0.438 | 0.587 |
| 98.66573033707866 | -0.168 | 0.317 | -0.429 | 0.587 |
| 98.8325140449438 | -0.177 | 0.317 | -0.419 | 0.587 |
| 98.99929775280897 | -0.196 | 0.317 | -0.41 | 0.587 |
| 99.16608146067416 | -0.196 | 0.335 | -0.401 | 0.587 |
| 99.33286516853933 | -0.205 | 0.345 | -0.391 | 0.587 |
| 99.49964887640449 | -0.205 | 0.354 | -0.382 | 0.587 |
| 99.66643258426966 | -0.196 | 0.354 | -0.382 | 0.578 |
| 99.83321629213484 | -0.186 | 0.345 | -0.363 | 0.568 |
| 100.0 | -0.186 | 0.354 | -0.363 | 0.568 |